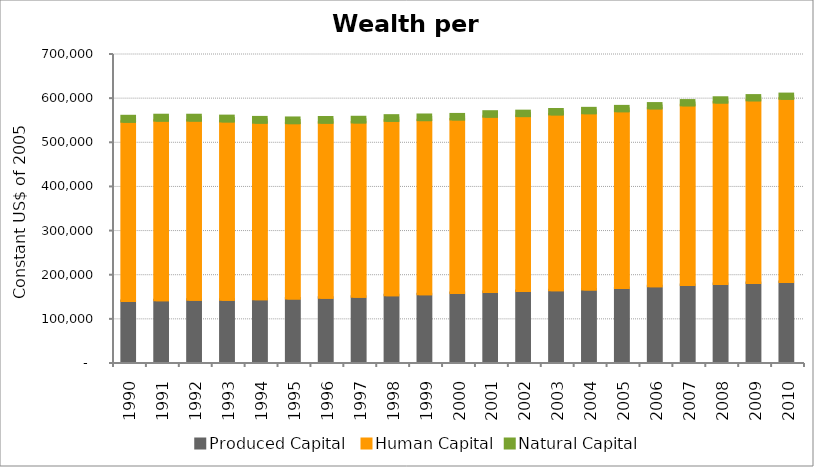
| Category | Produced Capital  | Human Capital | Natural Capital |
|---|---|---|---|
| 1990.0 | 137951.288 | 406316.729 | 12363.323 |
| 1991.0 | 140088.758 | 406689.981 | 12267.583 |
| 1992.0 | 140897.359 | 405994.281 | 12134.55 |
| 1993.0 | 141225.223 | 403777.67 | 12013.062 |
| 1994.0 | 142233.739 | 399945.041 | 11905.526 |
| 1995.0 | 143701.985 | 397338.126 | 11821.125 |
| 1996.0 | 145452.298 | 396680.167 | 11763.386 |
| 1997.0 | 147778.677 | 394906.84 | 11727.368 |
| 1998.0 | 151089.021 | 395264.321 | 11697.389 |
| 1999.0 | 153655.793 | 394259.166 | 11671.266 |
| 2000.0 | 156370.728 | 393114.963 | 11354.335 |
| 2001.0 | 158759.675 | 397005.419 | 11258.429 |
| 2002.0 | 160654.13 | 396416.277 | 11193.151 |
| 2003.0 | 162370.385 | 398528.858 | 11120.923 |
| 2004.0 | 164285.461 | 399299.295 | 11044.377 |
| 2005.0 | 167469.614 | 400625.495 | 10972.316 |
| 2006.0 | 171447.398 | 403105.974 | 10893.102 |
| 2007.0 | 174184.472 | 407247.359 | 10821.22 |
| 2008.0 | 176643.73 | 411187.047 | 10758.774 |
| 2009.0 | 179081.757 | 413732.817 | 10704.39 |
| 2010.0 | 181167.314 | 415110.864 | 10642.819 |